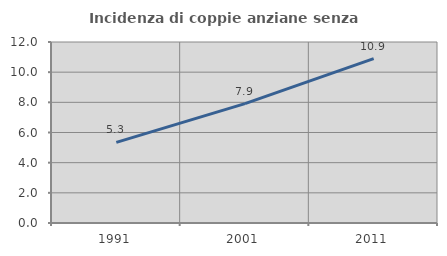
| Category | Incidenza di coppie anziane senza figli  |
|---|---|
| 1991.0 | 5.342 |
| 2001.0 | 7.918 |
| 2011.0 | 10.901 |